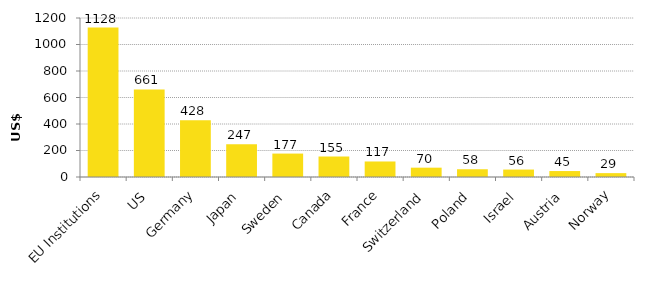
| Category | Series 0 |
|---|---|
| EU Institutions | 1127.59 |
| US | 660.98 |
| Germany | 427.92 |
| Japan | 247.3 |
| Sweden | 176.78 |
| Canada | 154.7 |
| France | 117.11 |
| Switzerland | 70.39 |
| Poland | 58.47 |
| Israel | 56.14 |
| Austria | 45.01 |
| Norway | 29.19 |